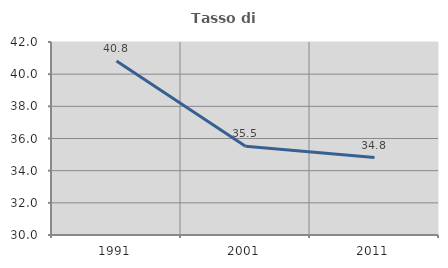
| Category | Tasso di occupazione   |
|---|---|
| 1991.0 | 40.82 |
| 2001.0 | 35.522 |
| 2011.0 | 34.812 |